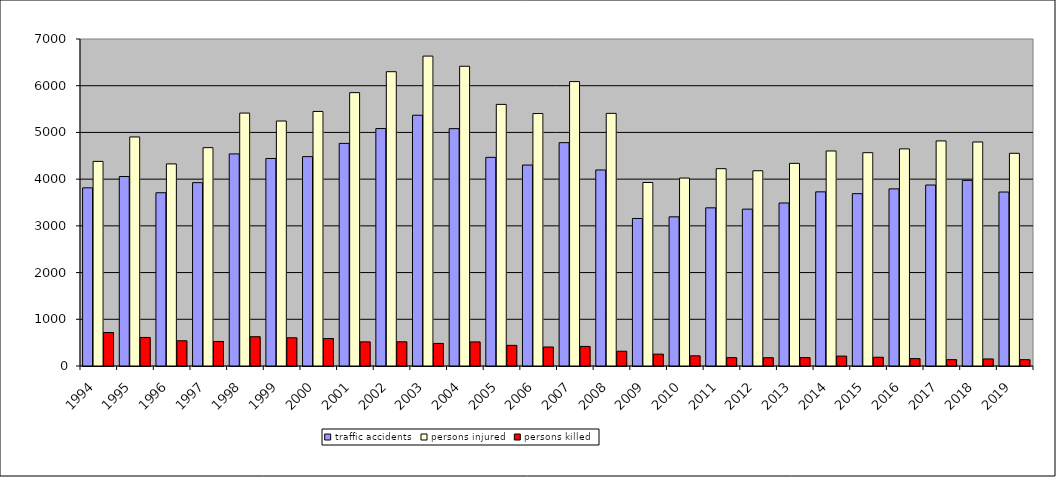
| Category | traffic accidents | persons injured | persons killed |
|---|---|---|---|
| 1994.0 | 3814 | 4380 | 717 |
| 1995.0 | 4056 | 4903 | 611 |
| 1996.0 | 3709 | 4326 | 540 |
| 1997.0 | 3925 | 4674 | 525 |
| 1998.0 | 4540 | 5414 | 627 |
| 1999.0 | 4442 | 5244 | 604 |
| 2000.0 | 4482 | 5449 | 588 |
| 2001.0 | 4766 | 5852 | 517 |
| 2002.0 | 5083 | 6300 | 518 |
| 2003.0 | 5368 | 6634 | 483 |
| 2004.0 | 5081 | 6416 | 516 |
| 2005.0 | 4466 | 5600 | 442 |
| 2006.0 | 4302 | 5404 | 407 |
| 2007.0 | 4781 | 6088 | 419 |
| 2008.0 | 4196 | 5408 | 316 |
| 2009.0 | 3158 | 3928 | 254 |
| 2010.0 | 3193 | 4023 | 218 |
| 2011.0 | 3386 | 4224 | 179 |
| 2012.0 | 3358 | 4179 | 177 |
| 2013.0 | 3489 | 4338 | 179 |
| 2014.0 | 3728 | 4603 | 212 |
| 2015.0 | 3689 | 4566 | 187 |
| 2016.0 | 3792 | 4648 | 158 |
| 2017.0 | 3874 | 4818 | 136 |
| 2018.0 | 3973 | 4795 | 151 |
| 2019.0 | 3724 | 4553 | 135 |